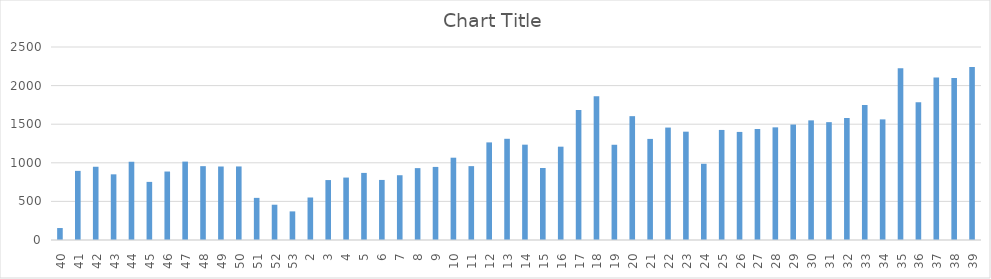
| Category | Series 0 |
|---|---|
| 40.0 | 155 |
| 41.0 | 895.429 |
| 42.0 | 948.714 |
| 43.0 | 850.571 |
| 44.0 | 1013.429 |
| 45.0 | 752.714 |
| 46.0 | 887 |
| 47.0 | 1015.429 |
| 48.0 | 956.429 |
| 49.0 | 952.143 |
| 50.0 | 952.714 |
| 51.0 | 545.714 |
| 52.0 | 457 |
| 53.0 | 370.571 |
| 2.0 | 550.571 |
| 3.0 | 776.429 |
| 4.0 | 808.714 |
| 5.0 | 869 |
| 6.0 | 778 |
| 7.0 | 839 |
| 8.0 | 931.143 |
| 9.0 | 946.571 |
| 10.0 | 1066 |
| 11.0 | 956.857 |
| 12.0 | 1264.429 |
| 13.0 | 1311 |
| 14.0 | 1234.857 |
| 15.0 | 933 |
| 16.0 | 1208.857 |
| 17.0 | 1683.286 |
| 18.0 | 1861.143 |
| 19.0 | 1233.571 |
| 20.0 | 1604.143 |
| 21.0 | 1309.429 |
| 22.0 | 1456.429 |
| 23.0 | 1403.143 |
| 24.0 | 987.286 |
| 25.0 | 1425.571 |
| 26.0 | 1400 |
| 27.0 | 1438.143 |
| 28.0 | 1459.143 |
| 29.0 | 1495.429 |
| 30.0 | 1549.714 |
| 31.0 | 1526.571 |
| 32.0 | 1580.143 |
| 33.0 | 1747.143 |
| 34.0 | 1562.429 |
| 35.0 | 2225.857 |
| 36.0 | 1784.429 |
| 37.0 | 2106.143 |
| 38.0 | 2098 |
| 39.0 | 2241.714 |